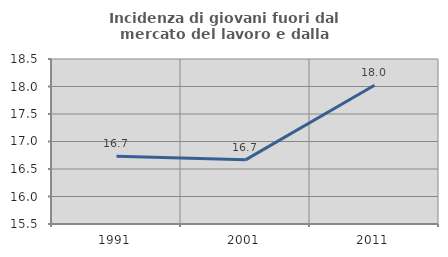
| Category | Incidenza di giovani fuori dal mercato del lavoro e dalla formazione  |
|---|---|
| 1991.0 | 16.73 |
| 2001.0 | 16.667 |
| 2011.0 | 18.022 |